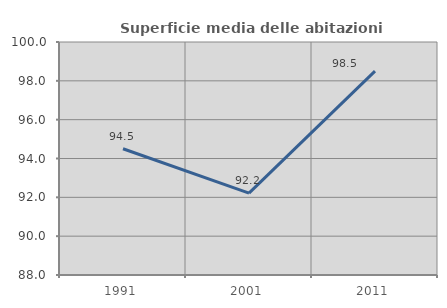
| Category | Superficie media delle abitazioni occupate |
|---|---|
| 1991.0 | 94.501 |
| 2001.0 | 92.214 |
| 2011.0 | 98.498 |